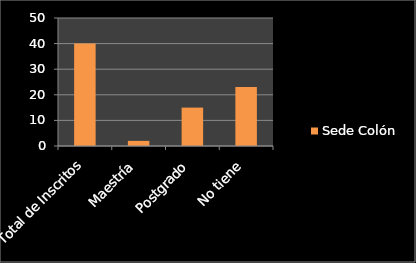
| Category | Sede Colón |
|---|---|
| Total de Inscritos | 40 |
| Maestría | 2 |
| Postgrado | 15 |
| No tiene | 23 |